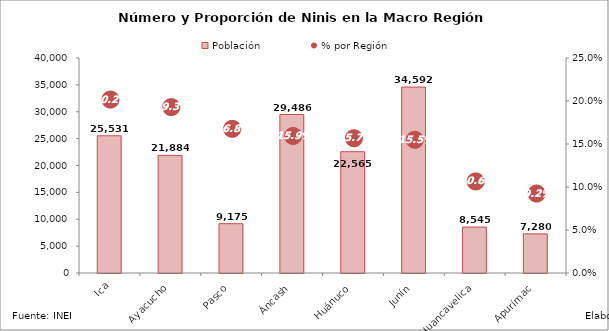
| Category | Población |
|---|---|
| Ica | 25530.82 |
| Ayacucho | 21883.96 |
| Pasco | 9174.61 |
| Áncash | 29486.24 |
| Huánuco | 22564.71 |
| Junín | 34592.16 |
| Huancavelica | 8545.3 |
| Apurímac | 7279.94 |